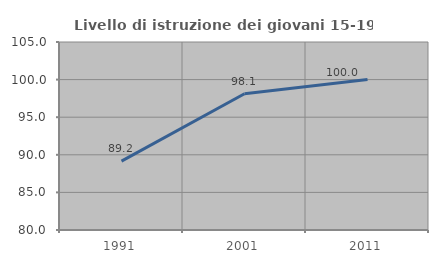
| Category | Livello di istruzione dei giovani 15-19 anni |
|---|---|
| 1991.0 | 89.157 |
| 2001.0 | 98.113 |
| 2011.0 | 100 |